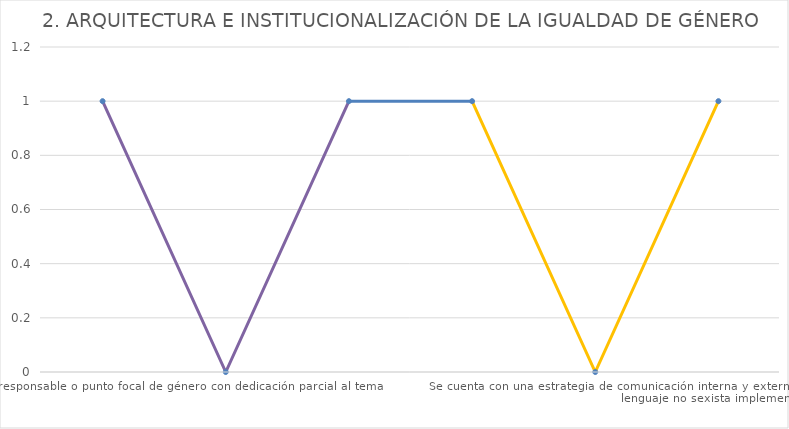
| Category | Series 0 |
|---|---|
| Se cuenta con una persona responsable o punto focal de género con dedicación parcial al tema    | 1 |
| Se cuenta con una unidad o equipo de género  con los recursos humanos especializados, responde directamente a la más alta autoridad institucional, tiene dedicación full time, tiene un plan anual de trabajo (POA), presupuesto asignado y en implementación.  | 0 |
| Se cuenta con una participación en instancias interinstitucionales y territoriales para contribuir al logro de la igualdad de género y los derechos de las mujeres.  | 1 |
| Se reportan resultados concretos con evidencias de su contribución a la coordinación interinstitucionales  y territoriales para la igualdad de género y los derechos de las mujeres. | 1 |
| Se cuenta con comunicaciones institucionales (internas y externas) que utilizan lenguaje e imágenes incluyente no sexista. _x000d_ | 0 |
| Se cuenta con una estrategia de comunicación interna y externa sensible a género que incluye imágenes y lenguaje no sexista implementada.  | 1 |